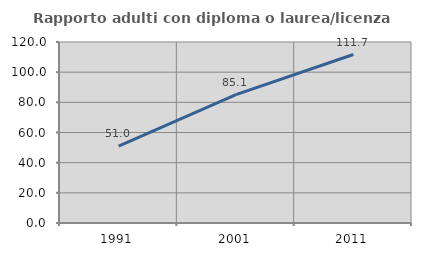
| Category | Rapporto adulti con diploma o laurea/licenza media  |
|---|---|
| 1991.0 | 51.005 |
| 2001.0 | 85.059 |
| 2011.0 | 111.697 |